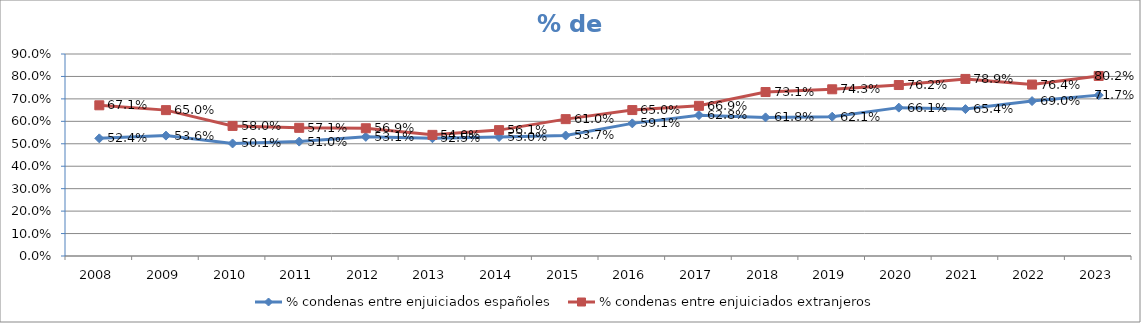
| Category | % condenas entre enjuiciados españoles | % condenas entre enjuiciados extranjeros |
|---|---|---|
| 2008.0 | 0.524 | 0.671 |
| 2009.0 | 0.536 | 0.65 |
| 2010.0 | 0.501 | 0.58 |
| 2011.0 | 0.51 | 0.571 |
| 2012.0 | 0.531 | 0.569 |
| 2013.0 | 0.525 | 0.54 |
| 2014.0 | 0.53 | 0.561 |
| 2015.0 | 0.537 | 0.61 |
| 2016.0 | 0.591 | 0.65 |
| 2017.0 | 0.628 | 0.669 |
| 2018.0 | 0.618 | 0.731 |
| 2019.0 | 0.621 | 0.743 |
| 2020.0 | 0.661 | 0.762 |
| 2021.0 | 0.654 | 0.789 |
| 2022.0 | 0.69 | 0.764 |
| 2023.0 | 0.717 | 0.802 |